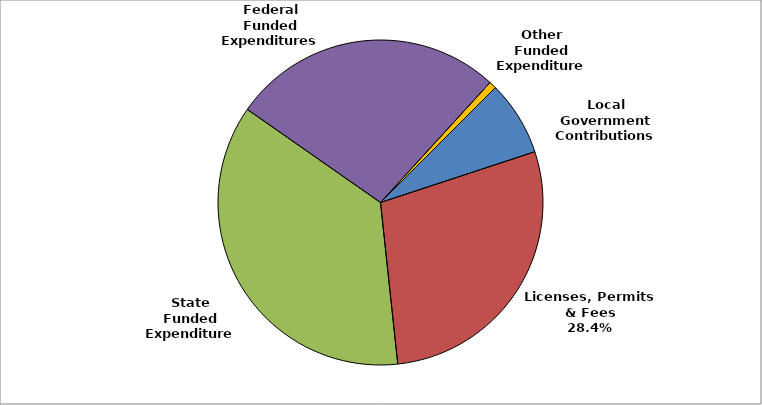
| Category | Series 0 |
|---|---|
| Local Government Contributions | 0.074 |
| Licenses, Permits & Fees | 0.284 |
| State Funded Expenditures | 0.364 |
| Federal Funded Expenditures | 0.271 |
| Other Funded Expenditures | 0.007 |